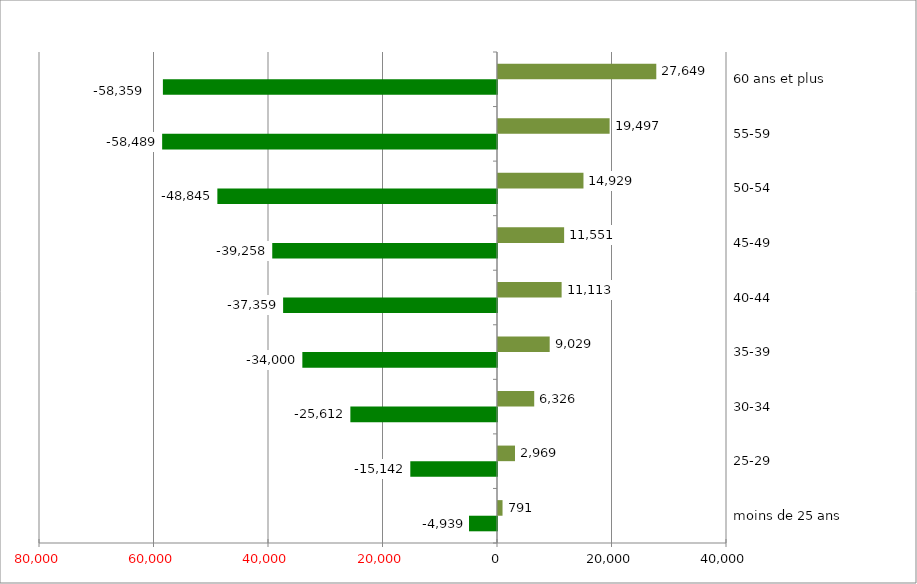
| Category | Series 0 | Series 1 |
|---|---|---|
| moins de 25 ans | -4939 | 791 |
| 25-29 | -15142 | 2969 |
| 30-34 | -25612 | 6326 |
| 35-39 | -34000 | 9029 |
| 40-44 | -37359 | 11113 |
| 45-49 | -39258 | 11551 |
| 50-54 | -48845 | 14929 |
| 55-59 | -58489 | 19497 |
| 60 ans et plus | -58359 | 27649 |